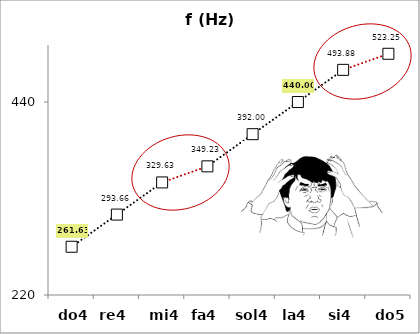
| Category | f (Hz) |
|---|---|
| do4 | 261.626 |
| re4 | 293.665 |
| mi4 | 329.628 |
| fa4 | 349.228 |
| sol4 | 391.995 |
| la4 | 440 |
| si4 | 493.883 |
| do5 | 523.251 |